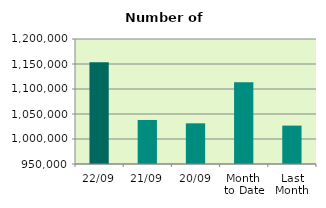
| Category | Series 0 |
|---|---|
| 22/09 | 1153584 |
| 21/09 | 1038078 |
| 20/09 | 1031380 |
| Month 
to Date | 1113583.375 |
| Last
Month | 1026775.304 |